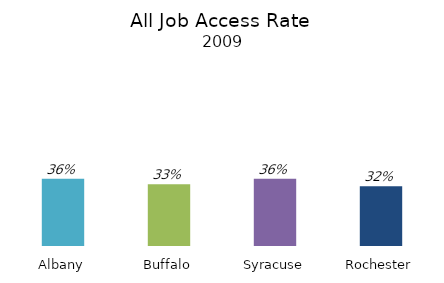
| Category | Series 0 |
|---|---|
| Albany | 0.36 |
| Buffalo | 0.33 |
| Syracuse | 0.36 |
| Rochester | 0.32 |